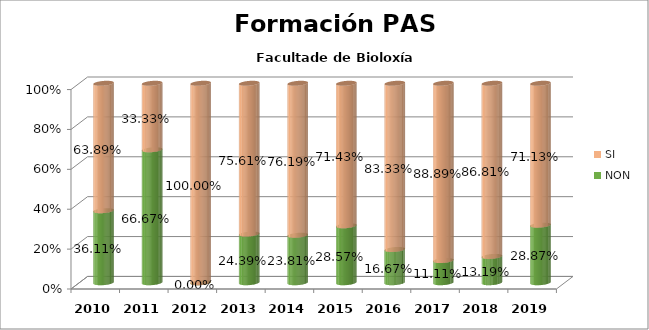
| Category | NON | SI |
|---|---|---|
| 2010.0 | 0.361 | 0.639 |
| 2011.0 | 0.667 | 0.333 |
| 2012.0 | 0 | 1 |
| 2013.0 | 0.244 | 0.756 |
| 2014.0 | 0.238 | 0.762 |
| 2015.0 | 0.286 | 0.714 |
| 2016.0 | 0.167 | 0.833 |
| 2017.0 | 0.111 | 0.889 |
| 2018.0 | 0.132 | 0.868 |
| 2019.0 | 0.289 | 0.711 |